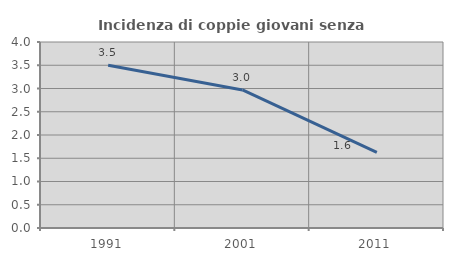
| Category | Incidenza di coppie giovani senza figli |
|---|---|
| 1991.0 | 3.498 |
| 2001.0 | 2.969 |
| 2011.0 | 1.624 |